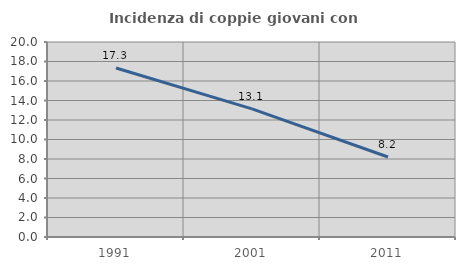
| Category | Incidenza di coppie giovani con figli |
|---|---|
| 1991.0 | 17.328 |
| 2001.0 | 13.144 |
| 2011.0 | 8.207 |